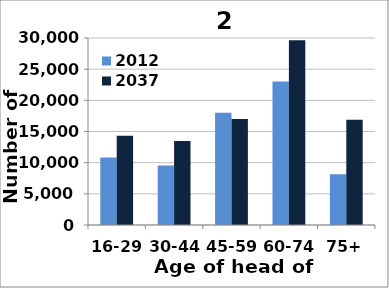
| Category | 2012 | 2037 |
|---|---|---|
| 16-29 | 10826 | 14301 |
| 30-44 | 9554 | 13457 |
| 45-59 | 18003 | 17024 |
| 60-74 | 23035 | 29637 |
| 75+ | 8144 | 16866 |